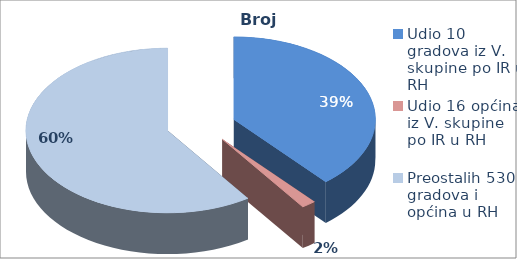
| Category | Broj poduz. |
|---|---|
| Udio 10 gradova iz V. skupine po IR u RH | 0.387 |
| Udio 16 općina iz V. skupine po IR u RH | 0.016 |
| Preostalih 530 gradova i općina u RH | 0.596 |